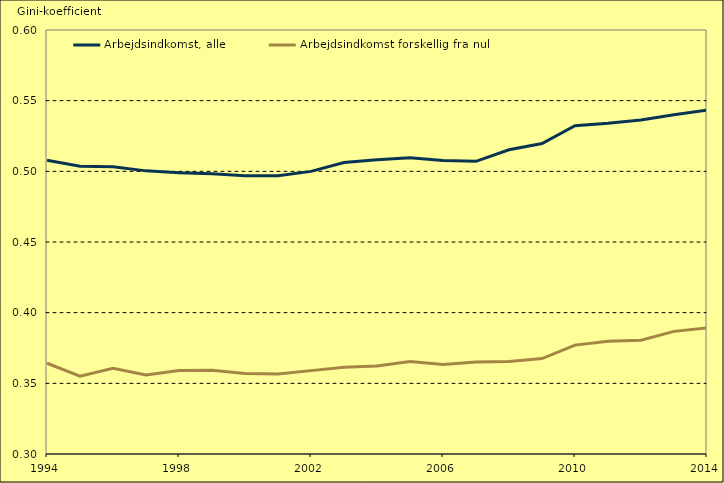
| Category | Arbejdsindkomst, alle | Arbejdsindkomst forskellig fra nul  |
|---|---|---|
| 1994.0 | 0.508 | 0.364 |
| 1995.0 | 0.504 | 0.355 |
| 1996.0 | 0.503 | 0.361 |
| 1997.0 | 0.5 | 0.356 |
| 1998.0 | 0.499 | 0.359 |
| 1999.0 | 0.498 | 0.359 |
| 2000.0 | 0.497 | 0.357 |
| 2001.0 | 0.497 | 0.357 |
| 2002.0 | 0.5 | 0.359 |
| 2003.0 | 0.506 | 0.361 |
| 2004.0 | 0.508 | 0.362 |
| 2005.0 | 0.51 | 0.365 |
| 2006.0 | 0.508 | 0.363 |
| 2007.0 | 0.507 | 0.365 |
| 2008.0 | 0.515 | 0.365 |
| 2009.0 | 0.52 | 0.368 |
| 2010.0 | 0.532 | 0.377 |
| 2011.0 | 0.534 | 0.38 |
| 2012.0 | 0.536 | 0.38 |
| 2013.0 | 0.54 | 0.387 |
| 2014.0 | 0.543 | 0.389 |